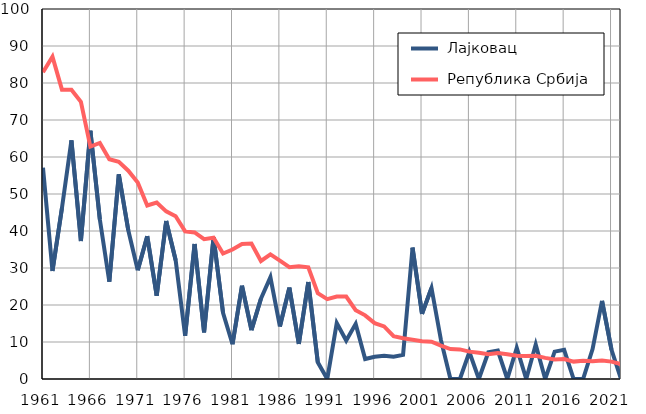
| Category |  Лајковац |  Република Србија |
|---|---|---|
| 1961.0 | 57.1 | 82.9 |
| 1962.0 | 29.2 | 87.1 |
| 1963.0 | 46.2 | 78.2 |
| 1964.0 | 64.5 | 78.2 |
| 1965.0 | 37.3 | 74.9 |
| 1966.0 | 67.1 | 62.8 |
| 1967.0 | 43.1 | 63.8 |
| 1968.0 | 26.3 | 59.4 |
| 1969.0 | 55.3 | 58.7 |
| 1970.0 | 40.2 | 56.3 |
| 1971.0 | 29.4 | 53.1 |
| 1972.0 | 38.6 | 46.9 |
| 1973.0 | 22.5 | 47.7 |
| 1974.0 | 42.7 | 45.3 |
| 1975.0 | 32.1 | 44 |
| 1976.0 | 11.7 | 39.9 |
| 1977.0 | 36.5 | 39.6 |
| 1978.0 | 12.6 | 37.8 |
| 1979.0 | 38.3 | 38.2 |
| 1980.0 | 17.9 | 33.9 |
| 1981.0 | 9.4 | 35 |
| 1982.0 | 25.2 | 36.5 |
| 1983.0 | 13.2 | 36.6 |
| 1984.0 | 21.7 | 31.9 |
| 1985.0 | 27.5 | 33.7 |
| 1986.0 | 14.2 | 32 |
| 1987.0 | 24.7 | 30.2 |
| 1988.0 | 9.5 | 30.5 |
| 1989.0 | 26.2 | 30.2 |
| 1990.0 | 4.5 | 23.2 |
| 1991.0 | 0 | 21.6 |
| 1992.0 | 15.1 | 22.3 |
| 1993.0 | 10.4 | 22.3 |
| 1994.0 | 14.9 | 18.6 |
| 1995.0 | 5.4 | 17.2 |
| 1996.0 | 6 | 15.1 |
| 1997.0 | 6.3 | 14.2 |
| 1998.0 | 6 | 11.6 |
| 1999.0 | 6.5 | 11 |
| 2000.0 | 35.5 | 10.6 |
| 2001.0 | 17.6 | 10.2 |
| 2002.0 | 24.6 | 10.1 |
| 2003.0 | 10.5 | 9 |
| 2004.0 | 0 | 8.1 |
| 2005.0 | 0 | 8 |
| 2006.0 | 7.3 | 7.4 |
| 2007.0 | 0 | 7.1 |
| 2008.0 | 7.2 | 6.7 |
| 2009.0 | 7.7 | 7 |
| 2010.0 | 0 | 6.7 |
| 2011.0 | 8.4 | 6.3 |
| 2012.0 | 0 | 6.2 |
| 2013.0 | 9.3 | 6.3 |
| 2014.0 | 0 | 5.7 |
| 2015.0 | 7.4 | 5.3 |
| 2016.0 | 7.9 | 5.4 |
| 2017.0 | 0 | 4.7 |
| 2018.0 | 0 | 4.9 |
| 2019.0 | 8.1 | 4.8 |
| 2020.0 | 21.1 | 5 |
| 2021.0 | 7.9 | 4.7 |
| 2022.0 | 0 | 4 |